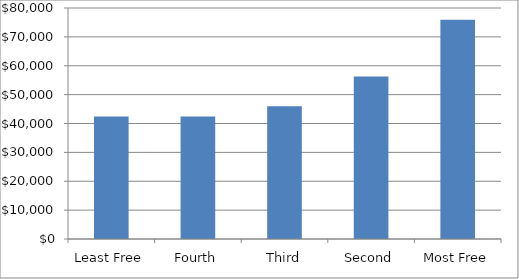
| Category | Series 0 |
|---|---|
| Least Free | 42447.232 |
| Fourth | 42399.24 |
| Third | 45979.047 |
| Second | 56307.437 |
| Most Free | 75932.545 |